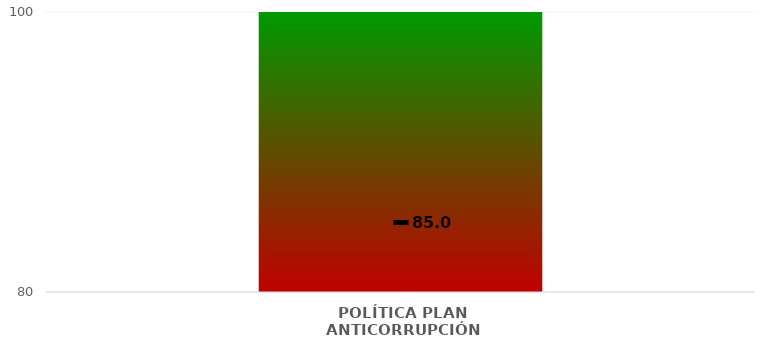
| Category | Niveles |
|---|---|
| POLÍTICA PLAN ANTICORRUPCIÓN | 100 |